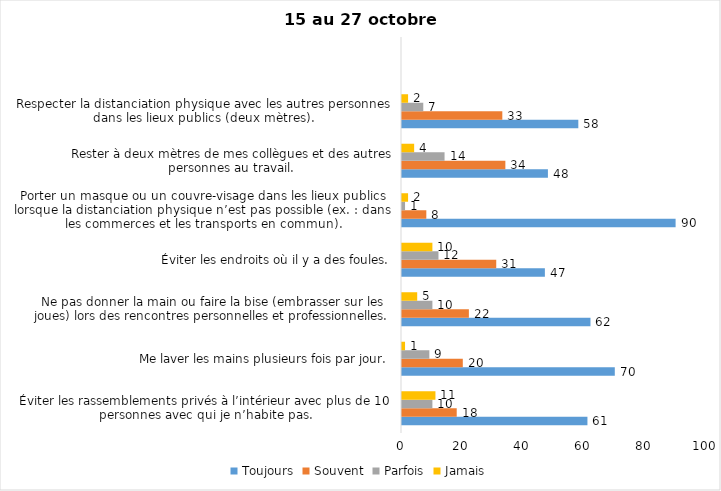
| Category | Toujours | Souvent | Parfois | Jamais |
|---|---|---|---|---|
| Éviter les rassemblements privés à l’intérieur avec plus de 10 personnes avec qui je n’habite pas. | 61 | 18 | 10 | 11 |
| Me laver les mains plusieurs fois par jour. | 70 | 20 | 9 | 1 |
| Ne pas donner la main ou faire la bise (embrasser sur les joues) lors des rencontres personnelles et professionnelles. | 62 | 22 | 10 | 5 |
| Éviter les endroits où il y a des foules. | 47 | 31 | 12 | 10 |
| Porter un masque ou un couvre-visage dans les lieux publics lorsque la distanciation physique n’est pas possible (ex. : dans les commerces et les transports en commun). | 90 | 8 | 1 | 2 |
| Rester à deux mètres de mes collègues et des autres personnes au travail. | 48 | 34 | 14 | 4 |
| Respecter la distanciation physique avec les autres personnes dans les lieux publics (deux mètres). | 58 | 33 | 7 | 2 |